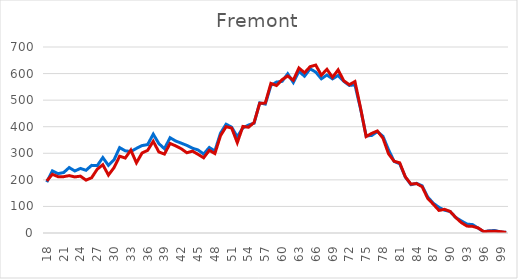
| Category | Series 0 | Alamosa |
|---|---|---|
| 18.0 | 191.534 | 196 |
| 19.0 | 233.692 | 221 |
| 20.0 | 223.436 | 212 |
| 21.0 | 227.429 | 212 |
| 22.0 | 246.251 | 216 |
| 23.0 | 233.395 | 211 |
| 24.0 | 242.941 | 214 |
| 25.0 | 236.052 | 199 |
| 26.0 | 254.533 | 208 |
| 27.0 | 253.398 | 240 |
| 28.0 | 283.876 | 257 |
| 29.0 | 254.526 | 218 |
| 30.0 | 275.283 | 246 |
| 31.0 | 321.354 | 289 |
| 32.0 | 309.247 | 282 |
| 33.0 | 306.647 | 312 |
| 34.0 | 318.405 | 264 |
| 35.0 | 328.946 | 301 |
| 36.0 | 332.774 | 311 |
| 37.0 | 371.986 | 345 |
| 38.0 | 336.48 | 305 |
| 39.0 | 317.058 | 297 |
| 40.0 | 358.608 | 337 |
| 41.0 | 346.26 | 328 |
| 42.0 | 338.06 | 317 |
| 43.0 | 329.734 | 302 |
| 44.0 | 319.279 | 308 |
| 45.0 | 312.321 | 296 |
| 46.0 | 297.183 | 283 |
| 47.0 | 321.84 | 311 |
| 48.0 | 308.569 | 299 |
| 49.0 | 375.492 | 366 |
| 50.0 | 409.449 | 400 |
| 51.0 | 398.129 | 395 |
| 52.0 | 362.086 | 340 |
| 53.0 | 395.673 | 401 |
| 54.0 | 406.173 | 398 |
| 55.0 | 413.12 | 416 |
| 56.0 | 489.832 | 488 |
| 57.0 | 485.155 | 489 |
| 58.0 | 555.066 | 563 |
| 59.0 | 567.998 | 555 |
| 60.0 | 570.706 | 577 |
| 61.0 | 599.191 | 591 |
| 62.0 | 566.476 | 575 |
| 63.0 | 608.43 | 621 |
| 64.0 | 590.099 | 603 |
| 65.0 | 617.962 | 626 |
| 66.0 | 605.64 | 632 |
| 67.0 | 580.317 | 594 |
| 68.0 | 594.624 | 616 |
| 69.0 | 580.097 | 586 |
| 70.0 | 592.929 | 614 |
| 71.0 | 570.786 | 573 |
| 72.0 | 555.31 | 558 |
| 73.0 | 557.604 | 570 |
| 74.0 | 467.22 | 471 |
| 75.0 | 365.565 | 363 |
| 76.0 | 367.137 | 375 |
| 77.0 | 381.532 | 384 |
| 78.0 | 364.057 | 357 |
| 79.0 | 313.204 | 298 |
| 80.0 | 269.367 | 270 |
| 81.0 | 260.489 | 264 |
| 82.0 | 210.494 | 211 |
| 83.0 | 181.816 | 184 |
| 84.0 | 186.824 | 186 |
| 85.0 | 177.606 | 174 |
| 86.0 | 135.29 | 130 |
| 87.0 | 111.778 | 108 |
| 88.0 | 96.545 | 85 |
| 89.0 | 85.808 | 89 |
| 90.0 | 80.757 | 81 |
| 91.0 | 58.369 | 58 |
| 92.0 | 45.431 | 39 |
| 93.0 | 33.606 | 26 |
| 94.0 | 31.552 | 25 |
| 95.0 | 18.129 | 19 |
| 96.0 | 4.833 | 5 |
| 97.0 | 8.498 | 7 |
| 98.0 | 9.307 | 7 |
| 99.0 | 3.723 | 5 |
| 100.0 | 2.564 | 2 |